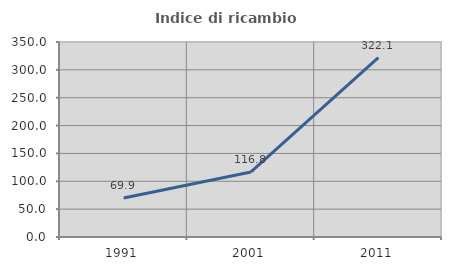
| Category | Indice di ricambio occupazionale  |
|---|---|
| 1991.0 | 69.884 |
| 2001.0 | 116.782 |
| 2011.0 | 322.093 |